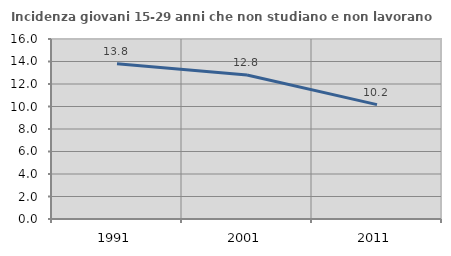
| Category | Incidenza giovani 15-29 anni che non studiano e non lavorano  |
|---|---|
| 1991.0 | 13.793 |
| 2001.0 | 12.802 |
| 2011.0 | 10.165 |